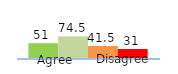
| Category | Series 0 | Series 1 | Series 2 | Series 3 |
|---|---|---|---|---|
| 0 | 51 | 74.5 | 41.5 | 31 |